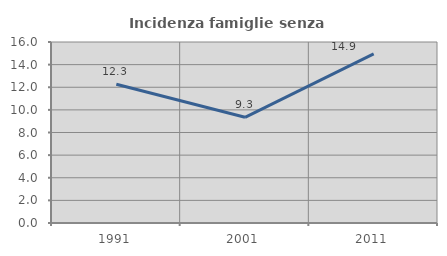
| Category | Incidenza famiglie senza nuclei |
|---|---|
| 1991.0 | 12.263 |
| 2001.0 | 9.343 |
| 2011.0 | 14.943 |